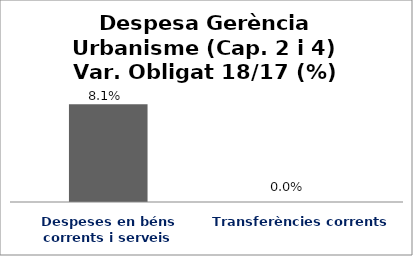
| Category | Series 0 |
|---|---|
| Despeses en béns corrents i serveis | 0.081 |
| Transferències corrents | 0 |